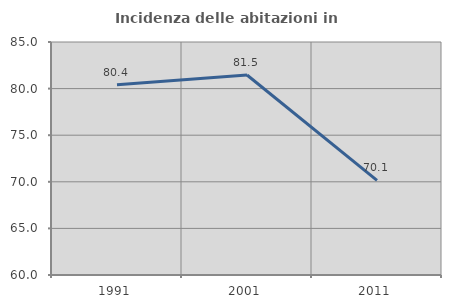
| Category | Incidenza delle abitazioni in proprietà  |
|---|---|
| 1991.0 | 80.42 |
| 2001.0 | 81.461 |
| 2011.0 | 70.149 |